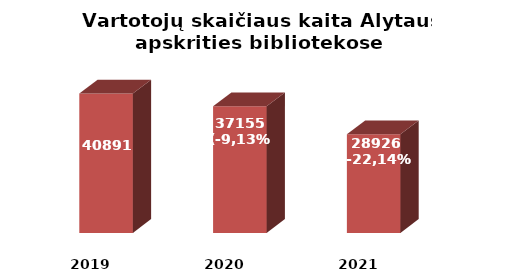
| Category | Series 0 |
|---|---|
| 2019.0 | 40891 |
| 2020.0 | 37155 |
| 2021.0 | 28926 |